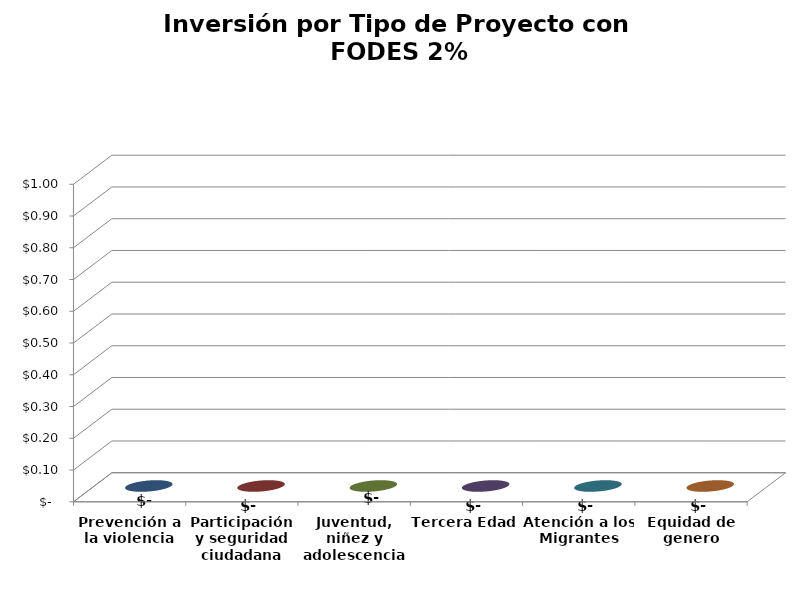
| Category | Series 0 |
|---|---|
| Prevención a la violencia | 0 |
| Participación y seguridad ciudadana | 0 |
| Juventud, niñez y adolescencia | 0 |
| Tercera Edad | 0 |
| Atención a los Migrantes | 0 |
| Equidad de genero | 0 |